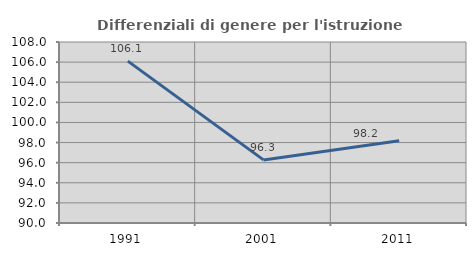
| Category | Differenziali di genere per l'istruzione superiore |
|---|---|
| 1991.0 | 106.101 |
| 2001.0 | 96.274 |
| 2011.0 | 98.188 |